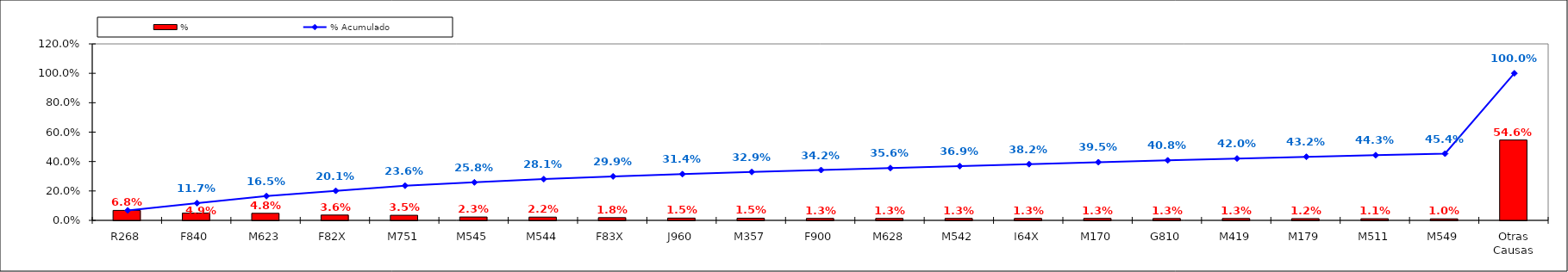
| Category | % |
|---|---|
| R268 | 0.068 |
| F840 | 0.049 |
| M623 | 0.048 |
| F82X | 0.036 |
| M751 | 0.035 |
| M545 | 0.023 |
| M544 | 0.022 |
| F83X | 0.018 |
| J960 | 0.015 |
| M357 | 0.015 |
| F900 | 0.013 |
| M628 | 0.013 |
| M542 | 0.013 |
| I64X | 0.013 |
| M170 | 0.013 |
| G810 | 0.013 |
| M419 | 0.013 |
| M179 | 0.012 |
| M511 | 0.011 |
| M549 | 0.01 |
| Otras Causas | 0.546 |